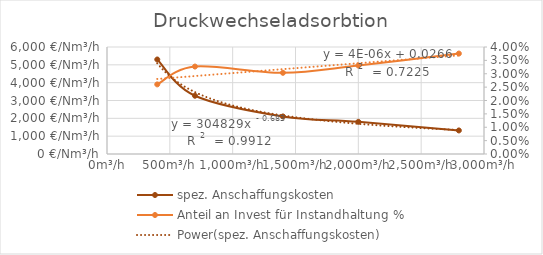
| Category | spez. Anschaffungskosten |
|---|---|
| 400.0 | 5299.475 |
| 700.0 | 3267.147 |
| 1400.0 | 2105.755 |
| 2000.0 | 1804.556 |
| 2800.0 | 1321.241 |